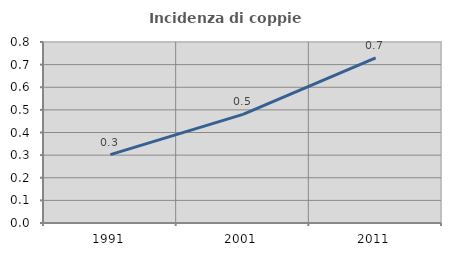
| Category | Incidenza di coppie miste |
|---|---|
| 1991.0 | 0.302 |
| 2001.0 | 0.48 |
| 2011.0 | 0.73 |